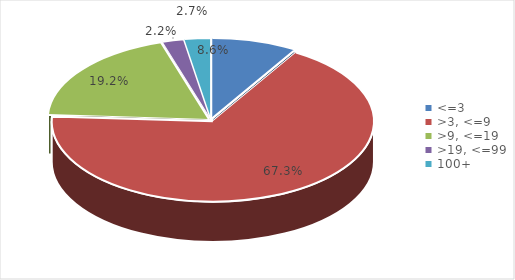
| Category | Enterprises  |
|---|---|
| <=3 | 0.086 |
| >3, <=9 | 0.673 |
| >9, <=19 | 0.192 |
| >19, <=99 | 0.022 |
| 100+ | 0.027 |